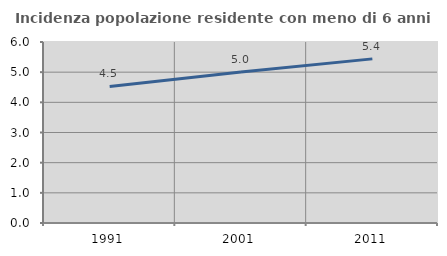
| Category | Incidenza popolazione residente con meno di 6 anni |
|---|---|
| 1991.0 | 4.529 |
| 2001.0 | 5.007 |
| 2011.0 | 5.441 |